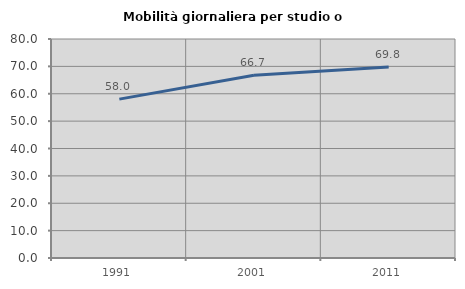
| Category | Mobilità giornaliera per studio o lavoro |
|---|---|
| 1991.0 | 58.029 |
| 2001.0 | 66.736 |
| 2011.0 | 69.808 |